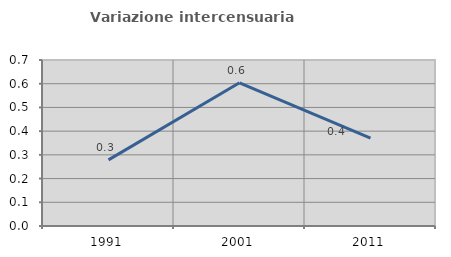
| Category | Variazione intercensuaria annua |
|---|---|
| 1991.0 | 0.279 |
| 2001.0 | 0.604 |
| 2011.0 | 0.371 |